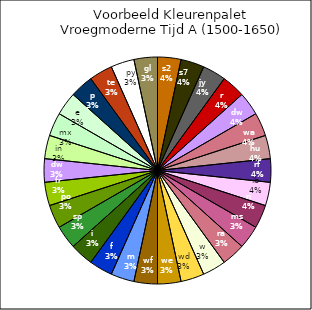
| Category | Series 0 |
|---|---|
| s2 | 1 |
| s7 | 1 |
| jy | 1 |
| r | 1 |
| dw | 1 |
| wa | 1 |
| hu | 1 |
| rf | 1 |
| ib | 1 |
| ri | 1 |
| ms | 1 |
| ra | 1 |
| w | 1 |
| wd | 1 |
| we | 1 |
| wf | 1 |
| m | 1 |
| f | 1 |
| i | 1 |
| sp | 1 |
| po | 1 |
| fr | 1 |
| dw | 1 |
| in | 1 |
| mx | 1 |
| e | 1 |
| p | 1 |
| te | 1 |
| py | 1 |
| gl | 1 |